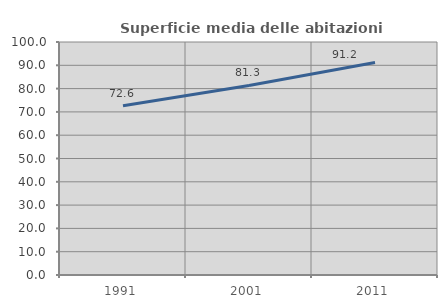
| Category | Superficie media delle abitazioni occupate |
|---|---|
| 1991.0 | 72.618 |
| 2001.0 | 81.341 |
| 2011.0 | 91.177 |